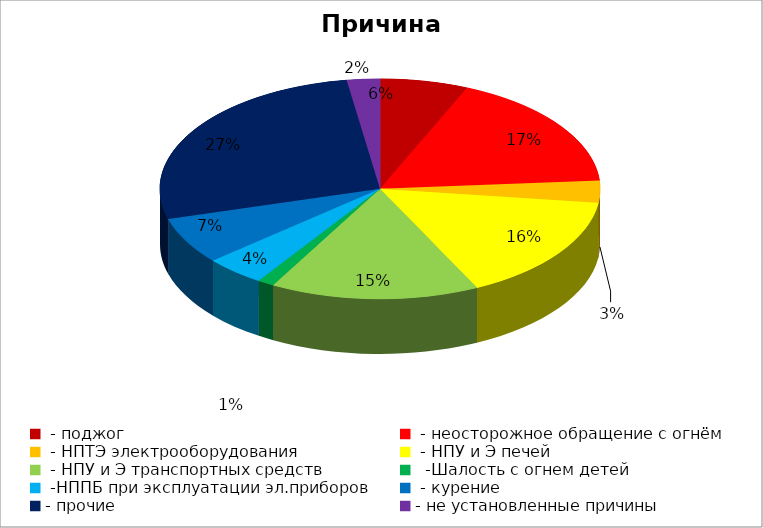
| Category | Причина пожара |
|---|---|
|  - поджог | 16 |
|  - неосторожное обращение с огнём | 43 |
|  - НПТЭ электрооборудования | 8 |
|  - НПУ и Э печей | 39 |
|  - НПУ и Э транспортных средств | 38 |
|   -Шалость с огнем детей | 3 |
|  -НППБ при эксплуатации эл.приборов | 11 |
|  - курение | 17 |
| - прочие | 67 |
| - не установленные причины | 6 |